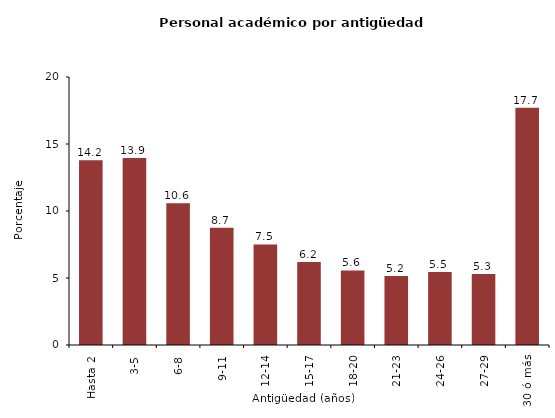
| Category | Series 0 |
|---|---|
| Hasta 2 | 13.784 |
| 3-5 | 13.949 |
| 6-8 | 10.584 |
| 9-11 | 8.743 |
| 12-14 | 7.502 |
| 15-17 | 6.2 |
| 18-20 | 5.567 |
| 21-23 | 5.153 |
| 24-26 | 5.454 |
| 27-29 | 5.306 |
| 30 ó más | 17.703 |